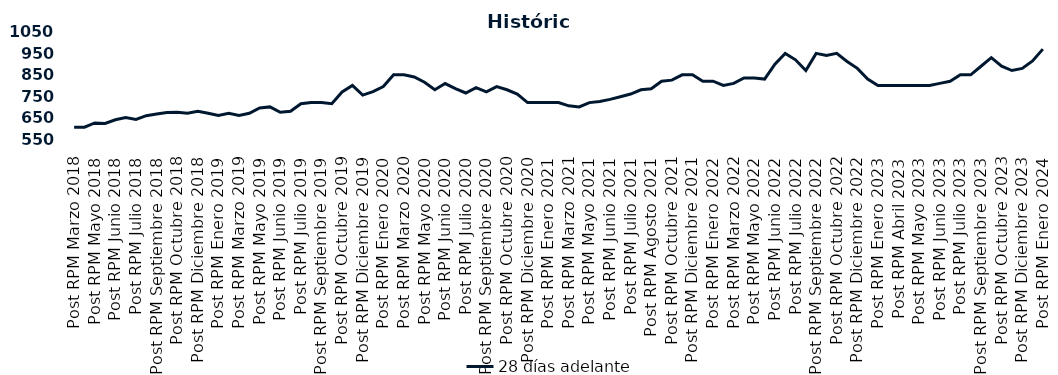
| Category | 28 días adelante |
|---|---|
| Post RPM Marzo 2018 | 605 |
| Pre RPM Mayo 2018 | 605 |
| Post RPM Mayo 2018 | 625 |
| Pre RPM Junio 2018 | 623 |
| Post RPM Junio 2018 | 640 |
| Pre RPM Julio 2018 | 650 |
| Post RPM Julio 2018 | 641 |
| Pre RPM Septiembre 2018 | 659 |
| Post RPM Septiembre 2018 | 666.75 |
| Pre RPM Octubre 2018 | 674 |
| Post RPM Octubre 2018 | 675 |
| Pre RPM Diciembre 2018 | 670 |
| Post RPM Diciembre 2018 | 680 |
| Pre RPM Enero 2019 | 670 |
| Post RPM Enero 2019 | 660 |
| Pre RPM Marzo 2019 | 670 |
| Post RPM Marzo 2019 | 660 |
| Pre RPM Mayo 2019 | 670 |
| Post RPM Mayo 2019 | 695 |
| Pre RPM Junio 2019 | 700 |
| Post RPM Junio 2019 | 675 |
| Pre RPM Julio 2019 | 680 |
| Post RPM Julio 2019 | 715 |
| Pre RPM Septiembre 2019 | 720 |
| Post RPM Septiembre 2019 | 720 |
| Pre RPM Octubre 2019 | 715 |
| Post RPM Octubre 2019 | 770 |
| Pre RPM Diciembre 2019 | 800 |
| Post RPM Diciembre 2019 | 755 |
| Pre RPM Enero 2020 | 771 |
| Post RPM Enero 2020 | 795 |
| Pre RPM Marzo 2020 | 850 |
| Post RPM Marzo 2020 | 850 |
| Pre RPM Mayo 2020 | 840 |
| Post RPM Mayo 2020 | 815 |
| Pre RPM Junio 2020 | 780 |
| Post RPM Junio 2020 | 809 |
| Pre RPM Julio 2020 | 785.72 |
| Post RPM Julio 2020 | 765 |
| Pre RPM Septiembre 2020 | 790 |
| Post RPM Septiembre 2020 | 770 |
| Pre RPM Octubre 2020 | 795 |
| Post RPM Octubre 2020 | 780 |
| Pre RPM Diciembre 2020 | 760 |
| Post RPM Diciembre 2020 | 720 |
| Pre RPM Enero 2021 | 720 |
| Post RPM Enero 2021 | 720 |
| Pre RPM Marzo 2021 | 720 |
| Post RPM Marzo 2021 | 705 |
| Pre RPM Mayo 2021 | 700 |
| Post RPM Mayo 2021 | 720 |
| Pre RPM Junio 2021 | 725 |
| Post RPM Junio 2021 | 735 |
| Pre RPM Julio 2021 | 747.5 |
| Post RPM Julio 2021 | 760 |
| Pre RPM Agosto 2021 | 780 |
| Post RPM Agosto 2021 | 785 |
| Pre RPM Octubre 2021 | 820 |
| Post RPM Octubre 2021 | 825 |
| Pre RPM Diciembre 2021 | 850 |
| Post RPM Diciembre 2021 | 850 |
| Pre RPM Enero 2022 | 820 |
| Post RPM Enero 2022 | 820 |
| Pre RPM Marzo 2022 | 800 |
| Post RPM Marzo 2022 | 810 |
| Pre RPM Mayo 2022 | 835 |
| Post RPM Mayo 2022 | 835 |
| Pre RPM Junio 2022 | 830 |
| Post RPM Junio 2022 | 900 |
| Pre RPM Julio 2022 | 950 |
| Post RPM Julio 2022 | 920 |
| Pre RPM Septiembre 2022 | 870 |
| Post RPM Septiembre 2022 | 950 |
| Pre RPM Octubre 2022 | 940 |
| Post RPM Octubre 2022 | 950 |
| Pre RPM Diciembre 2022 | 912.5 |
| Post RPM Diciembre 2022 | 880 |
| Pre RPM Enero 2023 | 830 |
| Post RPM Enero 2023 | 800 |
| Pre RPM Abril 2023 | 800 |
| Post RPM Abril 2023 | 800 |
| Pre RPM Mayo 2023 | 800 |
| Post RPM Mayo 2023 | 800 |
| Pre RPM Junio 2023 | 800 |
| Post RPM Junio 2023 | 810 |
| Pre RPM Julio 2023 | 820 |
| Post RPM Julio 2023 | 850 |
| Pre RPM Septiembre 2023 | 850 |
| Post RPM Septiembre 2023 | 890 |
| Pre RPM Octubre 2023 | 930 |
| Post RPM Octubre 2023 | 890 |
| Pre RPM Diciembre 2023 | 870 |
| Post RPM Diciembre 2023 | 880 |
| Pre RPM Enero 2024 | 915 |
| Post RPM Enero 2024 | 970 |